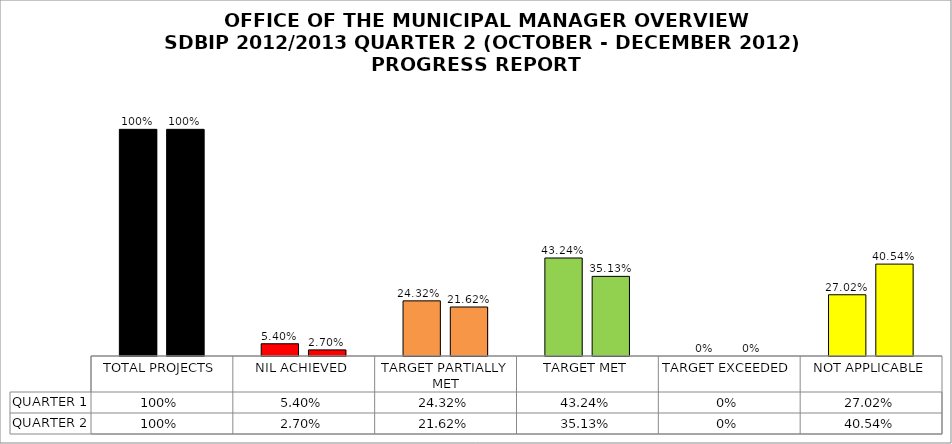
| Category | QUARTER 1 | QUARTER 2 |
|---|---|---|
| TOTAL PROJECTS | 1 | 1 |
| NIL ACHIEVED | 0.054 | 0.027 |
| TARGET PARTIALLY MET | 0.243 | 0.216 |
| TARGET MET | 0.432 | 0.351 |
| TARGET EXCEEDED | 0 | 0 |
| NOT APPLICABLE | 0.27 | 0.405 |